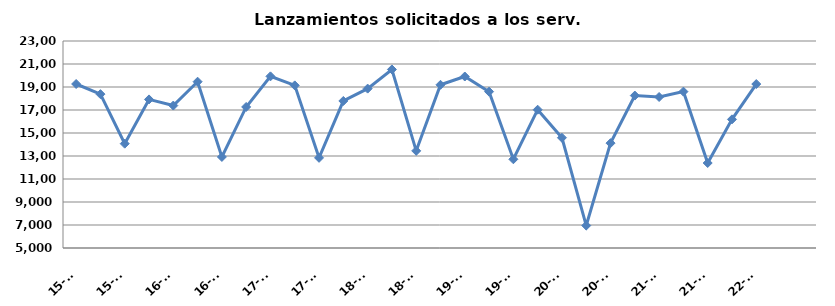
| Category | Lanzamientos solicitados a los Serv. comunes |
|---|---|
| 15-T1 | 19261 |
| 15-T2 | 18378 |
| 15-T3 | 14071 |
| 15-T4 | 17921 |
| 16-T1 | 17386 |
| 16-T2 | 19461 |
| 16-T3 | 12918 |
| 16-T4 | 17265 |
| 17-T1 | 19926 |
| 17-T2 | 19141 |
| 17-T3 | 12840 |
| 17-T4 | 17786 |
| 18-T1 | 18859 |
| 18-T2 | 20526 |
| 18-T3 | 13446 |
| 18-T4 | 19192 |
| 19-T1 | 19913 |
| 19-T2 | 18594 |
| 19-T3 | 12715 |
| 19-T4 | 17025 |
| 20-T1 | 14586 |
| 20-T2 | 6953 |
| 20-T3 | 14117 |
| 20-T4 | 18255 |
| 21-T1 | 18131 |
| 21-T2 | 18598 |
| 21-T3 | 12390 |
| 21-T4 | 16187 |
| 22-T1 | 19257 |